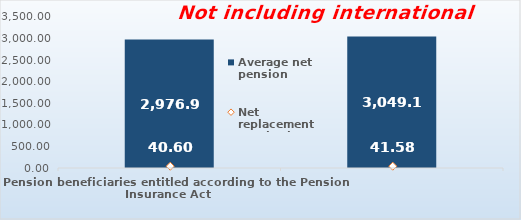
| Category | Average net pension  |
|---|---|
| Pension beneficiaries entitled according to the Pension Insurance Act   | 2976.93 |
| Pension beneficiaries entitled to pension FOR THE FIRST TIME in 2021 according to the Pension Insurance Act  - NEW BENEFICIARIES | 3049.133 |